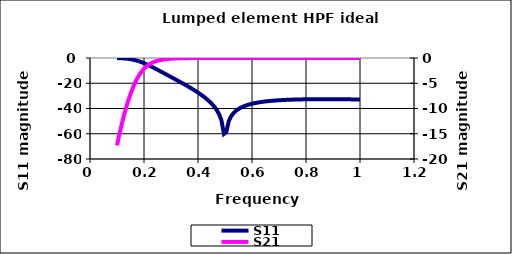
| Category | S11 |
|---|---|
| 0.1 | -0.081 |
| 0.10900000000000001 | -0.137 |
| 0.11800000000000002 | -0.223 |
| 0.12700000000000003 | -0.348 |
| 0.13600000000000004 | -0.524 |
| 0.14500000000000005 | -0.765 |
| 0.15400000000000005 | -1.083 |
| 0.16300000000000006 | -1.487 |
| 0.17200000000000007 | -1.985 |
| 0.18100000000000008 | -2.577 |
| 0.19000000000000009 | -3.259 |
| 0.1990000000000001 | -4.023 |
| 0.2080000000000001 | -4.857 |
| 0.2170000000000001 | -5.748 |
| 0.22600000000000012 | -6.684 |
| 0.23500000000000013 | -7.654 |
| 0.24400000000000013 | -8.647 |
| 0.2530000000000001 | -9.657 |
| 0.2620000000000001 | -10.678 |
| 0.27100000000000013 | -11.706 |
| 0.28000000000000014 | -12.739 |
| 0.28900000000000015 | -13.775 |
| 0.29800000000000015 | -14.814 |
| 0.30700000000000016 | -15.856 |
| 0.31600000000000017 | -16.903 |
| 0.3250000000000002 | -17.956 |
| 0.3340000000000002 | -19.017 |
| 0.3430000000000002 | -20.088 |
| 0.3520000000000002 | -21.174 |
| 0.3610000000000002 | -22.278 |
| 0.3700000000000002 | -23.405 |
| 0.3790000000000002 | -24.561 |
| 0.38800000000000023 | -25.751 |
| 0.39700000000000024 | -26.986 |
| 0.40600000000000025 | -28.275 |
| 0.41500000000000026 | -29.633 |
| 0.42400000000000027 | -31.078 |
| 0.4330000000000003 | -32.635 |
| 0.4420000000000003 | -34.34 |
| 0.4510000000000003 | -36.247 |
| 0.4600000000000003 | -38.442 |
| 0.4690000000000003 | -41.08 |
| 0.4780000000000003 | -44.473 |
| 0.4870000000000003 | -49.449 |
| 0.49600000000000033 | -60.085 |
| 0.5050000000000003 | -58.537 |
| 0.5140000000000003 | -49.977 |
| 0.5230000000000004 | -46.041 |
| 0.5320000000000004 | -43.541 |
| 0.5410000000000004 | -41.75 |
| 0.5500000000000004 | -40.382 |
| 0.5590000000000004 | -39.293 |
| 0.5680000000000004 | -38.402 |
| 0.5770000000000004 | -37.66 |
| 0.5860000000000004 | -37.031 |
| 0.5950000000000004 | -36.492 |
| 0.6040000000000004 | -36.026 |
| 0.6130000000000004 | -35.62 |
| 0.6220000000000004 | -35.264 |
| 0.6310000000000004 | -34.951 |
| 0.6400000000000005 | -34.674 |
| 0.6490000000000005 | -34.429 |
| 0.6580000000000005 | -34.21 |
| 0.6670000000000005 | -34.016 |
| 0.6760000000000005 | -33.843 |
| 0.6850000000000005 | -33.688 |
| 0.6940000000000005 | -33.55 |
| 0.7030000000000005 | -33.427 |
| 0.7120000000000005 | -33.317 |
| 0.7210000000000005 | -33.219 |
| 0.7300000000000005 | -33.131 |
| 0.7390000000000005 | -33.054 |
| 0.7480000000000006 | -32.985 |
| 0.7570000000000006 | -32.925 |
| 0.7660000000000006 | -32.872 |
| 0.7750000000000006 | -32.826 |
| 0.7840000000000006 | -32.786 |
| 0.7930000000000006 | -32.752 |
| 0.8020000000000006 | -32.723 |
| 0.8110000000000006 | -32.699 |
| 0.8200000000000006 | -32.679 |
| 0.8290000000000006 | -32.664 |
| 0.8380000000000006 | -32.652 |
| 0.8470000000000006 | -32.644 |
| 0.8560000000000006 | -32.639 |
| 0.8650000000000007 | -32.637 |
| 0.8740000000000007 | -32.638 |
| 0.8830000000000007 | -32.642 |
| 0.8920000000000007 | -32.648 |
| 0.9010000000000007 | -32.657 |
| 0.9100000000000007 | -32.667 |
| 0.9190000000000007 | -32.68 |
| 0.9280000000000007 | -32.694 |
| 0.9370000000000007 | -32.71 |
| 0.9460000000000007 | -32.728 |
| 0.9550000000000007 | -32.748 |
| 0.9640000000000007 | -32.768 |
| 0.9730000000000008 | -32.79 |
| 0.9820000000000008 | -32.814 |
| 0.9910000000000008 | -32.838 |
| 1.0000000000000007 | -32.864 |